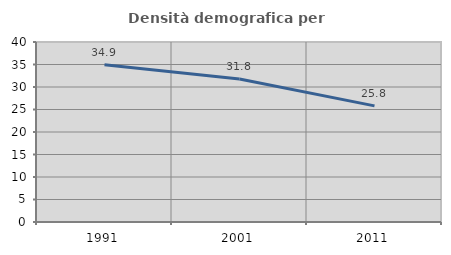
| Category | Densità demografica |
|---|---|
| 1991.0 | 34.944 |
| 2001.0 | 31.774 |
| 2011.0 | 25.809 |